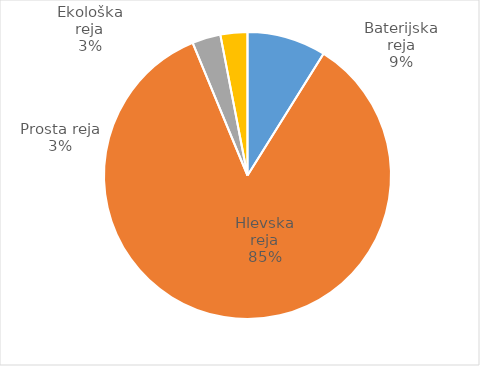
| Category | Količina kosov jajc |
|---|---|
| Baterijska reja | 320664 |
| Hlevska reja | 3064855 |
| Prosta reja | 115712 |
| Ekološka reja | 109676 |